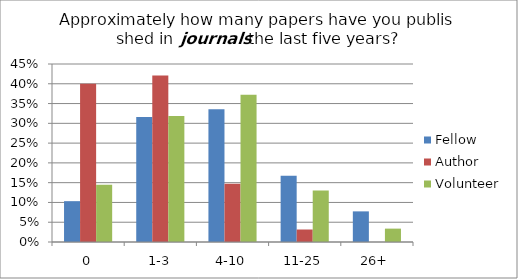
| Category | Fellow | Author | Volunteer |
|---|---|---|---|
| 0 | 0.103 | 0.4 | 0.145 |
| 1-3 | 0.316 | 0.421 | 0.319 |
| 4-10 | 0.335 | 0.147 | 0.372 |
| 11-25 | 0.168 | 0.032 | 0.13 |
| 26+ | 0.077 | 0 | 0.034 |